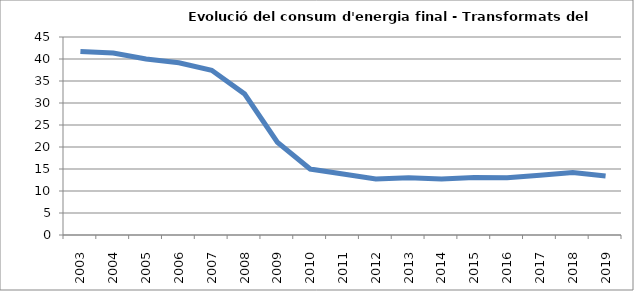
| Category | 41,7 |
|---|---|
| 2003.0 | 41.73 |
| 2004.0 | 41.34 |
| 2005.0 | 40.02 |
| 2006.0 | 39.16 |
| 2007.0 | 37.43 |
| 2008.0 | 32.07 |
| 2009.0 | 21.08 |
| 2010.0 | 14.99 |
| 2011.0 | 13.86 |
| 2012.0 | 12.72 |
| 2013.0 | 13.03 |
| 2014.0 | 12.7 |
| 2015.0 | 13.05 |
| 2016.0 | 13.02 |
| 2017.0 | 13.56 |
| 2018.0 | 14.19 |
| 2019.0 | 13.42 |